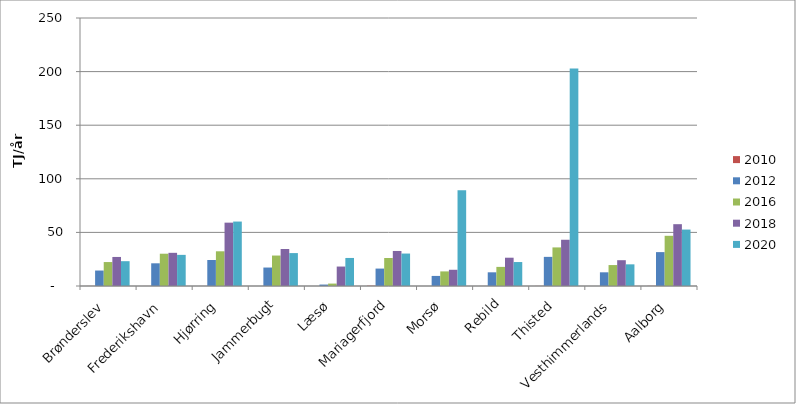
| Category | 2010 | 2012 | 2016 | 2018 | 2020 |
|---|---|---|---|---|---|
| Brønderslev | 0.076 | 14.43 | 22.343 | 27.094 | 23.148 |
| Frederikshavn | 0.043 | 21.173 | 30.115 | 30.947 | 29.046 |
| Hjørring | 0.04 | 24.266 | 32.376 | 59.091 | 60.116 |
| Jammerbugt | 0 | 17.219 | 28.415 | 34.531 | 30.704 |
| Læsø | 0 | 1.347 | 2.255 | 18.146 | 26.159 |
| Mariagerfjord | 0.283 | 16.253 | 26.118 | 32.682 | 30.272 |
| Morsø | 0.02 | 9.404 | 13.616 | 15.135 | 89.289 |
| Rebild | 0.04 | 12.77 | 17.824 | 26.39 | 22.352 |
| Thisted | 0.09 | 27.178 | 35.995 | 43.134 | 202.86 |
| Vesthimmerlands | 0.016 | 12.77 | 19.537 | 24.064 | 20.208 |
| Aalborg | 0.126 | 31.611 | 46.827 | 57.667 | 52.644 |